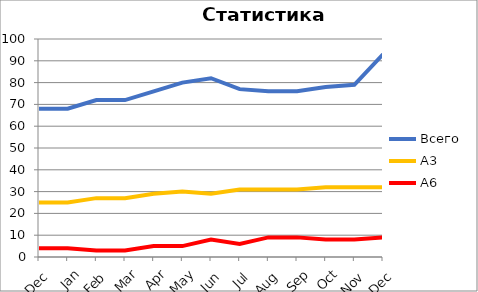
| Category | Всего | А3 | A6 |
|---|---|---|---|
| Dec | 68 | 25 | 4 |
| Jan | 68 | 25 | 4 |
| Feb | 72 | 27 | 3 |
| Mar | 72 | 27 | 3 |
| Apr | 76 | 29 | 5 |
| May | 80 | 30 | 5 |
| Jun | 82 | 29 | 8 |
| Jul | 77 | 31 | 6 |
| Aug | 76 | 31 | 9 |
| Sep | 76 | 31 | 9 |
| Oct | 78 | 32 | 8 |
| Nov | 79 | 32 | 8 |
| Dec | 93 | 32 | 9 |